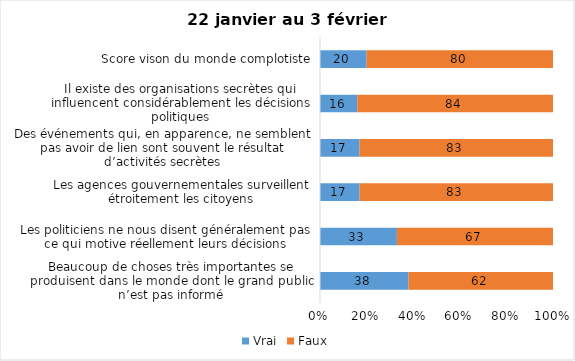
| Category | Vrai | Faux |
|---|---|---|
| Beaucoup de choses très importantes se produisent dans le monde dont le grand public n’est pas informé | 38 | 62 |
| Les politiciens ne nous disent généralement pas ce qui motive réellement leurs décisions | 33 | 67 |
| Les agences gouvernementales surveillent étroitement les citoyens | 17 | 83 |
| Des événements qui, en apparence, ne semblent pas avoir de lien sont souvent le résultat d’activités secrètes | 17 | 83 |
| Il existe des organisations secrètes qui influencent considérablement les décisions politiques | 16 | 84 |
| Score vison du monde complotiste | 20 | 80 |